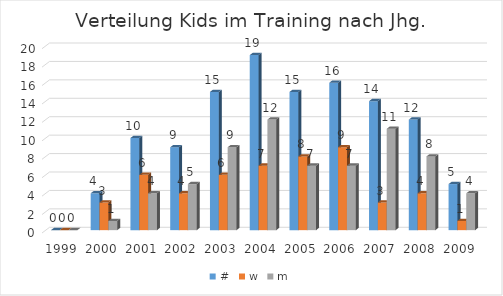
| Category | # | w | m |
|---|---|---|---|
| 1999.0 | 0 | 0 | 0 |
| 2000.0 | 4 | 3 | 1 |
| 2001.0 | 10 | 6 | 4 |
| 2002.0 | 9 | 4 | 5 |
| 2003.0 | 15 | 6 | 9 |
| 2004.0 | 19 | 7 | 12 |
| 2005.0 | 15 | 8 | 7 |
| 2006.0 | 16 | 9 | 7 |
| 2007.0 | 14 | 3 | 11 |
| 2008.0 | 12 | 4 | 8 |
| 2009.0 | 5 | 1 | 4 |